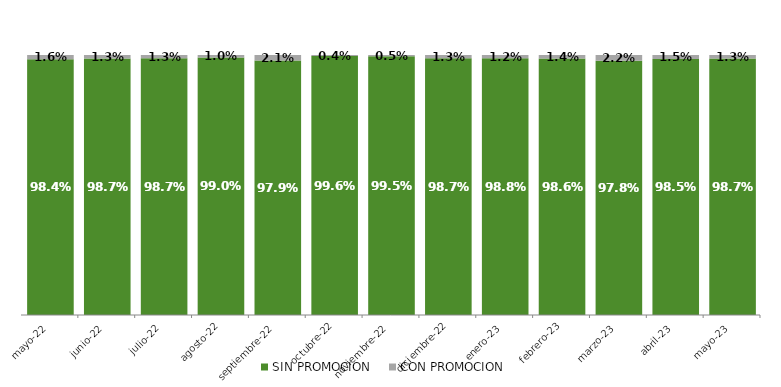
| Category | SIN PROMOCION   | CON PROMOCION   |
|---|---|---|
| 2022-05-01 | 0.984 | 0.016 |
| 2022-06-01 | 0.987 | 0.013 |
| 2022-07-01 | 0.987 | 0.013 |
| 2022-08-01 | 0.99 | 0.01 |
| 2022-09-01 | 0.979 | 0.021 |
| 2022-10-01 | 0.996 | 0.004 |
| 2022-11-01 | 0.995 | 0.005 |
| 2022-12-01 | 0.987 | 0.013 |
| 2023-01-01 | 0.988 | 0.012 |
| 2023-02-01 | 0.986 | 0.014 |
| 2023-03-01 | 0.978 | 0.022 |
| 2023-04-01 | 0.985 | 0.015 |
| 2023-05-01 | 0.987 | 0.013 |